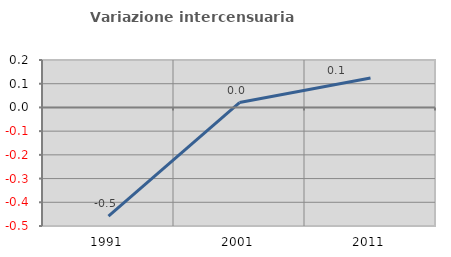
| Category | Variazione intercensuaria annua |
|---|---|
| 1991.0 | -0.458 |
| 2001.0 | 0.02 |
| 2011.0 | 0.124 |